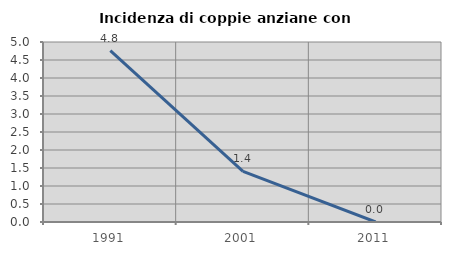
| Category | Incidenza di coppie anziane con figli |
|---|---|
| 1991.0 | 4.762 |
| 2001.0 | 1.408 |
| 2011.0 | 0 |